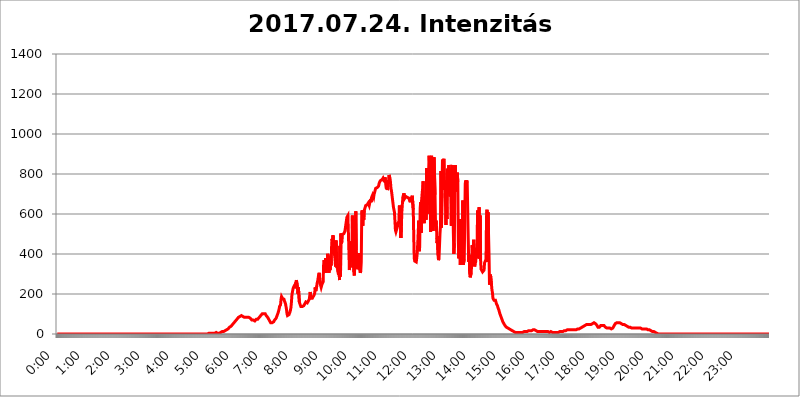
| Category | 2017.07.24. Intenzitás [W/m^2] |
|---|---|
| 0.0 | 0 |
| 0.0006944444444444445 | 0 |
| 0.001388888888888889 | 0 |
| 0.0020833333333333333 | 0 |
| 0.002777777777777778 | 0 |
| 0.003472222222222222 | 0 |
| 0.004166666666666667 | 0 |
| 0.004861111111111111 | 0 |
| 0.005555555555555556 | 0 |
| 0.0062499999999999995 | 0 |
| 0.006944444444444444 | 0 |
| 0.007638888888888889 | 0 |
| 0.008333333333333333 | 0 |
| 0.009027777777777779 | 0 |
| 0.009722222222222222 | 0 |
| 0.010416666666666666 | 0 |
| 0.011111111111111112 | 0 |
| 0.011805555555555555 | 0 |
| 0.012499999999999999 | 0 |
| 0.013194444444444444 | 0 |
| 0.013888888888888888 | 0 |
| 0.014583333333333332 | 0 |
| 0.015277777777777777 | 0 |
| 0.015972222222222224 | 0 |
| 0.016666666666666666 | 0 |
| 0.017361111111111112 | 0 |
| 0.018055555555555557 | 0 |
| 0.01875 | 0 |
| 0.019444444444444445 | 0 |
| 0.02013888888888889 | 0 |
| 0.020833333333333332 | 0 |
| 0.02152777777777778 | 0 |
| 0.022222222222222223 | 0 |
| 0.02291666666666667 | 0 |
| 0.02361111111111111 | 0 |
| 0.024305555555555556 | 0 |
| 0.024999999999999998 | 0 |
| 0.025694444444444447 | 0 |
| 0.02638888888888889 | 0 |
| 0.027083333333333334 | 0 |
| 0.027777777777777776 | 0 |
| 0.02847222222222222 | 0 |
| 0.029166666666666664 | 0 |
| 0.029861111111111113 | 0 |
| 0.030555555555555555 | 0 |
| 0.03125 | 0 |
| 0.03194444444444445 | 0 |
| 0.03263888888888889 | 0 |
| 0.03333333333333333 | 0 |
| 0.034027777777777775 | 0 |
| 0.034722222222222224 | 0 |
| 0.035416666666666666 | 0 |
| 0.036111111111111115 | 0 |
| 0.03680555555555556 | 0 |
| 0.0375 | 0 |
| 0.03819444444444444 | 0 |
| 0.03888888888888889 | 0 |
| 0.03958333333333333 | 0 |
| 0.04027777777777778 | 0 |
| 0.04097222222222222 | 0 |
| 0.041666666666666664 | 0 |
| 0.042361111111111106 | 0 |
| 0.04305555555555556 | 0 |
| 0.043750000000000004 | 0 |
| 0.044444444444444446 | 0 |
| 0.04513888888888889 | 0 |
| 0.04583333333333334 | 0 |
| 0.04652777777777778 | 0 |
| 0.04722222222222222 | 0 |
| 0.04791666666666666 | 0 |
| 0.04861111111111111 | 0 |
| 0.049305555555555554 | 0 |
| 0.049999999999999996 | 0 |
| 0.05069444444444445 | 0 |
| 0.051388888888888894 | 0 |
| 0.052083333333333336 | 0 |
| 0.05277777777777778 | 0 |
| 0.05347222222222222 | 0 |
| 0.05416666666666667 | 0 |
| 0.05486111111111111 | 0 |
| 0.05555555555555555 | 0 |
| 0.05625 | 0 |
| 0.05694444444444444 | 0 |
| 0.057638888888888885 | 0 |
| 0.05833333333333333 | 0 |
| 0.05902777777777778 | 0 |
| 0.059722222222222225 | 0 |
| 0.06041666666666667 | 0 |
| 0.061111111111111116 | 0 |
| 0.06180555555555556 | 0 |
| 0.0625 | 0 |
| 0.06319444444444444 | 0 |
| 0.06388888888888888 | 0 |
| 0.06458333333333334 | 0 |
| 0.06527777777777778 | 0 |
| 0.06597222222222222 | 0 |
| 0.06666666666666667 | 0 |
| 0.06736111111111111 | 0 |
| 0.06805555555555555 | 0 |
| 0.06874999999999999 | 0 |
| 0.06944444444444443 | 0 |
| 0.07013888888888889 | 0 |
| 0.07083333333333333 | 0 |
| 0.07152777777777779 | 0 |
| 0.07222222222222223 | 0 |
| 0.07291666666666667 | 0 |
| 0.07361111111111111 | 0 |
| 0.07430555555555556 | 0 |
| 0.075 | 0 |
| 0.07569444444444444 | 0 |
| 0.0763888888888889 | 0 |
| 0.07708333333333334 | 0 |
| 0.07777777777777778 | 0 |
| 0.07847222222222222 | 0 |
| 0.07916666666666666 | 0 |
| 0.0798611111111111 | 0 |
| 0.08055555555555556 | 0 |
| 0.08125 | 0 |
| 0.08194444444444444 | 0 |
| 0.08263888888888889 | 0 |
| 0.08333333333333333 | 0 |
| 0.08402777777777777 | 0 |
| 0.08472222222222221 | 0 |
| 0.08541666666666665 | 0 |
| 0.08611111111111112 | 0 |
| 0.08680555555555557 | 0 |
| 0.08750000000000001 | 0 |
| 0.08819444444444445 | 0 |
| 0.08888888888888889 | 0 |
| 0.08958333333333333 | 0 |
| 0.09027777777777778 | 0 |
| 0.09097222222222222 | 0 |
| 0.09166666666666667 | 0 |
| 0.09236111111111112 | 0 |
| 0.09305555555555556 | 0 |
| 0.09375 | 0 |
| 0.09444444444444444 | 0 |
| 0.09513888888888888 | 0 |
| 0.09583333333333333 | 0 |
| 0.09652777777777777 | 0 |
| 0.09722222222222222 | 0 |
| 0.09791666666666667 | 0 |
| 0.09861111111111111 | 0 |
| 0.09930555555555555 | 0 |
| 0.09999999999999999 | 0 |
| 0.10069444444444443 | 0 |
| 0.1013888888888889 | 0 |
| 0.10208333333333335 | 0 |
| 0.10277777777777779 | 0 |
| 0.10347222222222223 | 0 |
| 0.10416666666666667 | 0 |
| 0.10486111111111111 | 0 |
| 0.10555555555555556 | 0 |
| 0.10625 | 0 |
| 0.10694444444444444 | 0 |
| 0.1076388888888889 | 0 |
| 0.10833333333333334 | 0 |
| 0.10902777777777778 | 0 |
| 0.10972222222222222 | 0 |
| 0.1111111111111111 | 0 |
| 0.11180555555555556 | 0 |
| 0.11180555555555556 | 0 |
| 0.1125 | 0 |
| 0.11319444444444444 | 0 |
| 0.11388888888888889 | 0 |
| 0.11458333333333333 | 0 |
| 0.11527777777777777 | 0 |
| 0.11597222222222221 | 0 |
| 0.11666666666666665 | 0 |
| 0.1173611111111111 | 0 |
| 0.11805555555555557 | 0 |
| 0.11944444444444445 | 0 |
| 0.12013888888888889 | 0 |
| 0.12083333333333333 | 0 |
| 0.12152777777777778 | 0 |
| 0.12222222222222223 | 0 |
| 0.12291666666666667 | 0 |
| 0.12291666666666667 | 0 |
| 0.12361111111111112 | 0 |
| 0.12430555555555556 | 0 |
| 0.125 | 0 |
| 0.12569444444444444 | 0 |
| 0.12638888888888888 | 0 |
| 0.12708333333333333 | 0 |
| 0.16875 | 0 |
| 0.12847222222222224 | 0 |
| 0.12916666666666668 | 0 |
| 0.12986111111111112 | 0 |
| 0.13055555555555556 | 0 |
| 0.13125 | 0 |
| 0.13194444444444445 | 0 |
| 0.1326388888888889 | 0 |
| 0.13333333333333333 | 0 |
| 0.13402777777777777 | 0 |
| 0.13402777777777777 | 0 |
| 0.13472222222222222 | 0 |
| 0.13541666666666666 | 0 |
| 0.1361111111111111 | 0 |
| 0.13749999999999998 | 0 |
| 0.13819444444444443 | 0 |
| 0.1388888888888889 | 0 |
| 0.13958333333333334 | 0 |
| 0.14027777777777778 | 0 |
| 0.14097222222222222 | 0 |
| 0.14166666666666666 | 0 |
| 0.1423611111111111 | 0 |
| 0.14305555555555557 | 0 |
| 0.14375000000000002 | 0 |
| 0.14444444444444446 | 0 |
| 0.1451388888888889 | 0 |
| 0.1451388888888889 | 0 |
| 0.14652777777777778 | 0 |
| 0.14722222222222223 | 0 |
| 0.14791666666666667 | 0 |
| 0.1486111111111111 | 0 |
| 0.14930555555555555 | 0 |
| 0.15 | 0 |
| 0.15069444444444444 | 0 |
| 0.15138888888888888 | 0 |
| 0.15208333333333332 | 0 |
| 0.15277777777777776 | 0 |
| 0.15347222222222223 | 0 |
| 0.15416666666666667 | 0 |
| 0.15486111111111112 | 0 |
| 0.15555555555555556 | 0 |
| 0.15625 | 0 |
| 0.15694444444444444 | 0 |
| 0.15763888888888888 | 0 |
| 0.15833333333333333 | 0 |
| 0.15902777777777777 | 0 |
| 0.15972222222222224 | 0 |
| 0.16041666666666668 | 0 |
| 0.16111111111111112 | 0 |
| 0.16180555555555556 | 0 |
| 0.1625 | 0 |
| 0.16319444444444445 | 0 |
| 0.1638888888888889 | 0 |
| 0.16458333333333333 | 0 |
| 0.16527777777777777 | 0 |
| 0.16597222222222222 | 0 |
| 0.16666666666666666 | 0 |
| 0.1673611111111111 | 0 |
| 0.16805555555555554 | 0 |
| 0.16874999999999998 | 0 |
| 0.16944444444444443 | 0 |
| 0.17013888888888887 | 0 |
| 0.1708333333333333 | 0 |
| 0.17152777777777775 | 0 |
| 0.17222222222222225 | 0 |
| 0.1729166666666667 | 0 |
| 0.17361111111111113 | 0 |
| 0.17430555555555557 | 0 |
| 0.17500000000000002 | 0 |
| 0.17569444444444446 | 0 |
| 0.1763888888888889 | 0 |
| 0.17708333333333334 | 0 |
| 0.17777777777777778 | 0 |
| 0.17847222222222223 | 0 |
| 0.17916666666666667 | 0 |
| 0.1798611111111111 | 0 |
| 0.18055555555555555 | 0 |
| 0.18125 | 0 |
| 0.18194444444444444 | 0 |
| 0.1826388888888889 | 0 |
| 0.18333333333333335 | 0 |
| 0.1840277777777778 | 0 |
| 0.18472222222222223 | 0 |
| 0.18541666666666667 | 0 |
| 0.18611111111111112 | 0 |
| 0.18680555555555556 | 0 |
| 0.1875 | 0 |
| 0.18819444444444444 | 0 |
| 0.18888888888888888 | 0 |
| 0.18958333333333333 | 0 |
| 0.19027777777777777 | 0 |
| 0.1909722222222222 | 0 |
| 0.19166666666666665 | 0 |
| 0.19236111111111112 | 0 |
| 0.19305555555555554 | 0 |
| 0.19375 | 0 |
| 0.19444444444444445 | 0 |
| 0.1951388888888889 | 0 |
| 0.19583333333333333 | 0 |
| 0.19652777777777777 | 0 |
| 0.19722222222222222 | 0 |
| 0.19791666666666666 | 0 |
| 0.1986111111111111 | 0 |
| 0.19930555555555554 | 0 |
| 0.19999999999999998 | 0 |
| 0.20069444444444443 | 0 |
| 0.20138888888888887 | 0 |
| 0.2020833333333333 | 0 |
| 0.2027777777777778 | 0 |
| 0.2034722222222222 | 0 |
| 0.2041666666666667 | 0 |
| 0.20486111111111113 | 0 |
| 0.20555555555555557 | 0 |
| 0.20625000000000002 | 0 |
| 0.20694444444444446 | 0 |
| 0.2076388888888889 | 0 |
| 0.20833333333333334 | 0 |
| 0.20902777777777778 | 0 |
| 0.20972222222222223 | 0 |
| 0.21041666666666667 | 0 |
| 0.2111111111111111 | 3.525 |
| 0.21180555555555555 | 3.525 |
| 0.2125 | 3.525 |
| 0.21319444444444444 | 3.525 |
| 0.2138888888888889 | 3.525 |
| 0.21458333333333335 | 3.525 |
| 0.2152777777777778 | 3.525 |
| 0.21597222222222223 | 3.525 |
| 0.21666666666666667 | 3.525 |
| 0.21736111111111112 | 3.525 |
| 0.21805555555555556 | 3.525 |
| 0.21875 | 3.525 |
| 0.21944444444444444 | 3.525 |
| 0.22013888888888888 | 3.525 |
| 0.22083333333333333 | 3.525 |
| 0.22152777777777777 | 3.525 |
| 0.2222222222222222 | 3.525 |
| 0.22291666666666665 | 7.887 |
| 0.2236111111111111 | 3.525 |
| 0.22430555555555556 | 3.525 |
| 0.225 | 3.525 |
| 0.22569444444444445 | 3.525 |
| 0.2263888888888889 | 3.525 |
| 0.22708333333333333 | 3.525 |
| 0.22777777777777777 | 7.887 |
| 0.22847222222222222 | 7.887 |
| 0.22916666666666666 | 7.887 |
| 0.2298611111111111 | 7.887 |
| 0.23055555555555554 | 7.887 |
| 0.23124999999999998 | 12.257 |
| 0.23194444444444443 | 12.257 |
| 0.23263888888888887 | 12.257 |
| 0.2333333333333333 | 12.257 |
| 0.2340277777777778 | 12.257 |
| 0.2347222222222222 | 16.636 |
| 0.2354166666666667 | 16.636 |
| 0.23611111111111113 | 16.636 |
| 0.23680555555555557 | 21.024 |
| 0.23750000000000002 | 21.024 |
| 0.23819444444444446 | 25.419 |
| 0.2388888888888889 | 25.419 |
| 0.23958333333333334 | 25.419 |
| 0.24027777777777778 | 29.823 |
| 0.24097222222222223 | 29.823 |
| 0.24166666666666667 | 34.234 |
| 0.2423611111111111 | 34.234 |
| 0.24305555555555555 | 38.653 |
| 0.24375 | 38.653 |
| 0.24444444444444446 | 43.079 |
| 0.24513888888888888 | 43.079 |
| 0.24583333333333335 | 47.511 |
| 0.2465277777777778 | 47.511 |
| 0.24722222222222223 | 51.951 |
| 0.24791666666666667 | 56.398 |
| 0.24861111111111112 | 56.398 |
| 0.24930555555555556 | 60.85 |
| 0.25 | 65.31 |
| 0.25069444444444444 | 65.31 |
| 0.2513888888888889 | 69.775 |
| 0.2520833333333333 | 74.246 |
| 0.25277777777777777 | 78.722 |
| 0.2534722222222222 | 78.722 |
| 0.25416666666666665 | 83.205 |
| 0.2548611111111111 | 87.692 |
| 0.2555555555555556 | 87.692 |
| 0.25625000000000003 | 87.692 |
| 0.2569444444444445 | 92.184 |
| 0.2576388888888889 | 92.184 |
| 0.25833333333333336 | 92.184 |
| 0.2590277777777778 | 87.692 |
| 0.25972222222222224 | 87.692 |
| 0.2604166666666667 | 87.692 |
| 0.2611111111111111 | 83.205 |
| 0.26180555555555557 | 83.205 |
| 0.2625 | 83.205 |
| 0.26319444444444445 | 83.205 |
| 0.2638888888888889 | 83.205 |
| 0.26458333333333334 | 83.205 |
| 0.2652777777777778 | 83.205 |
| 0.2659722222222222 | 83.205 |
| 0.26666666666666666 | 83.205 |
| 0.2673611111111111 | 83.205 |
| 0.26805555555555555 | 83.205 |
| 0.26875 | 83.205 |
| 0.26944444444444443 | 83.205 |
| 0.2701388888888889 | 83.205 |
| 0.2708333333333333 | 78.722 |
| 0.27152777777777776 | 74.246 |
| 0.2722222222222222 | 74.246 |
| 0.27291666666666664 | 69.775 |
| 0.2736111111111111 | 69.775 |
| 0.2743055555555555 | 69.775 |
| 0.27499999999999997 | 69.775 |
| 0.27569444444444446 | 69.775 |
| 0.27638888888888885 | 65.31 |
| 0.27708333333333335 | 65.31 |
| 0.2777777777777778 | 69.775 |
| 0.27847222222222223 | 69.775 |
| 0.2791666666666667 | 74.246 |
| 0.2798611111111111 | 74.246 |
| 0.28055555555555556 | 74.246 |
| 0.28125 | 74.246 |
| 0.28194444444444444 | 78.722 |
| 0.2826388888888889 | 78.722 |
| 0.2833333333333333 | 83.205 |
| 0.28402777777777777 | 83.205 |
| 0.2847222222222222 | 87.692 |
| 0.28541666666666665 | 92.184 |
| 0.28611111111111115 | 96.682 |
| 0.28680555555555554 | 96.682 |
| 0.28750000000000003 | 101.184 |
| 0.2881944444444445 | 101.184 |
| 0.2888888888888889 | 101.184 |
| 0.28958333333333336 | 101.184 |
| 0.2902777777777778 | 101.184 |
| 0.29097222222222224 | 101.184 |
| 0.2916666666666667 | 101.184 |
| 0.2923611111111111 | 96.682 |
| 0.29305555555555557 | 92.184 |
| 0.29375 | 92.184 |
| 0.29444444444444445 | 87.692 |
| 0.2951388888888889 | 83.205 |
| 0.29583333333333334 | 78.722 |
| 0.2965277777777778 | 74.246 |
| 0.2972222222222222 | 69.775 |
| 0.29791666666666666 | 65.31 |
| 0.2986111111111111 | 60.85 |
| 0.29930555555555555 | 56.398 |
| 0.3 | 56.398 |
| 0.30069444444444443 | 56.398 |
| 0.3013888888888889 | 56.398 |
| 0.3020833333333333 | 56.398 |
| 0.30277777777777776 | 60.85 |
| 0.3034722222222222 | 60.85 |
| 0.30416666666666664 | 65.31 |
| 0.3048611111111111 | 69.775 |
| 0.3055555555555555 | 69.775 |
| 0.30624999999999997 | 74.246 |
| 0.3069444444444444 | 78.722 |
| 0.3076388888888889 | 83.205 |
| 0.30833333333333335 | 92.184 |
| 0.3090277777777778 | 96.682 |
| 0.30972222222222223 | 105.69 |
| 0.3104166666666667 | 114.716 |
| 0.3111111111111111 | 123.758 |
| 0.31180555555555556 | 137.347 |
| 0.3125 | 137.347 |
| 0.31319444444444444 | 146.423 |
| 0.3138888888888889 | 173.709 |
| 0.3145833333333333 | 187.378 |
| 0.31527777777777777 | 191.937 |
| 0.3159722222222222 | 178.264 |
| 0.31666666666666665 | 182.82 |
| 0.31736111111111115 | 178.264 |
| 0.31805555555555554 | 173.709 |
| 0.31875000000000003 | 164.605 |
| 0.3194444444444445 | 160.056 |
| 0.3201388888888889 | 150.964 |
| 0.32083333333333336 | 146.423 |
| 0.3215277777777778 | 123.758 |
| 0.32222222222222224 | 101.184 |
| 0.3229166666666667 | 92.184 |
| 0.3236111111111111 | 92.184 |
| 0.32430555555555557 | 92.184 |
| 0.325 | 96.682 |
| 0.32569444444444445 | 101.184 |
| 0.3263888888888889 | 110.201 |
| 0.32708333333333334 | 119.235 |
| 0.3277777777777778 | 132.814 |
| 0.3284722222222222 | 160.056 |
| 0.32916666666666666 | 196.497 |
| 0.3298611111111111 | 210.182 |
| 0.33055555555555555 | 223.873 |
| 0.33125 | 233 |
| 0.33194444444444443 | 233 |
| 0.3326388888888889 | 242.127 |
| 0.3333333333333333 | 228.436 |
| 0.3340277777777778 | 228.436 |
| 0.3347222222222222 | 255.813 |
| 0.3354166666666667 | 269.49 |
| 0.3361111111111111 | 264.932 |
| 0.3368055555555556 | 237.564 |
| 0.33749999999999997 | 201.058 |
| 0.33819444444444446 | 233 |
| 0.33888888888888885 | 228.436 |
| 0.33958333333333335 | 160.056 |
| 0.34027777777777773 | 150.964 |
| 0.34097222222222223 | 146.423 |
| 0.3416666666666666 | 137.347 |
| 0.3423611111111111 | 137.347 |
| 0.3430555555555555 | 137.347 |
| 0.34375 | 137.347 |
| 0.3444444444444445 | 137.347 |
| 0.3451388888888889 | 141.884 |
| 0.3458333333333334 | 141.884 |
| 0.34652777777777777 | 146.423 |
| 0.34722222222222227 | 150.964 |
| 0.34791666666666665 | 155.509 |
| 0.34861111111111115 | 160.056 |
| 0.34930555555555554 | 160.056 |
| 0.35000000000000003 | 155.509 |
| 0.3506944444444444 | 155.509 |
| 0.3513888888888889 | 160.056 |
| 0.3520833333333333 | 164.605 |
| 0.3527777777777778 | 169.156 |
| 0.3534722222222222 | 173.709 |
| 0.3541666666666667 | 191.937 |
| 0.3548611111111111 | 210.182 |
| 0.35555555555555557 | 178.264 |
| 0.35625 | 182.82 |
| 0.35694444444444445 | 178.264 |
| 0.3576388888888889 | 178.264 |
| 0.35833333333333334 | 182.82 |
| 0.3590277777777778 | 187.378 |
| 0.3597222222222222 | 191.937 |
| 0.36041666666666666 | 196.497 |
| 0.3611111111111111 | 205.62 |
| 0.36180555555555555 | 233 |
| 0.3625 | 214.746 |
| 0.36319444444444443 | 210.182 |
| 0.3638888888888889 | 237.564 |
| 0.3645833333333333 | 255.813 |
| 0.3652777777777778 | 264.932 |
| 0.3659722222222222 | 264.932 |
| 0.3666666666666667 | 296.808 |
| 0.3673611111111111 | 305.898 |
| 0.3680555555555556 | 305.898 |
| 0.36874999999999997 | 251.251 |
| 0.36944444444444446 | 242.127 |
| 0.37013888888888885 | 233 |
| 0.37083333333333335 | 242.127 |
| 0.37152777777777773 | 251.251 |
| 0.37222222222222223 | 255.813 |
| 0.3729166666666666 | 260.373 |
| 0.3736111111111111 | 346.682 |
| 0.3743055555555555 | 369.23 |
| 0.375 | 373.729 |
| 0.3756944444444445 | 333.113 |
| 0.3763888888888889 | 378.224 |
| 0.3770833333333334 | 305.898 |
| 0.37777777777777777 | 364.728 |
| 0.37847222222222227 | 324.052 |
| 0.37916666666666665 | 400.638 |
| 0.37986111111111115 | 396.164 |
| 0.38055555555555554 | 382.715 |
| 0.38125000000000003 | 305.898 |
| 0.3819444444444444 | 387.202 |
| 0.3826388888888889 | 319.517 |
| 0.3833333333333333 | 369.23 |
| 0.3840277777777778 | 342.162 |
| 0.3847222222222222 | 431.833 |
| 0.3854166666666667 | 475.972 |
| 0.3861111111111111 | 458.38 |
| 0.38680555555555557 | 493.475 |
| 0.3875 | 493.475 |
| 0.38819444444444445 | 422.943 |
| 0.3888888888888889 | 396.164 |
| 0.38958333333333334 | 373.729 |
| 0.3902777777777778 | 337.639 |
| 0.3909722222222222 | 467.187 |
| 0.39166666666666666 | 391.685 |
| 0.3923611111111111 | 328.584 |
| 0.39305555555555555 | 342.162 |
| 0.39375 | 310.44 |
| 0.39444444444444443 | 296.808 |
| 0.3951388888888889 | 351.198 |
| 0.3958333333333333 | 269.49 |
| 0.3965277777777778 | 440.702 |
| 0.3972222222222222 | 287.709 |
| 0.3979166666666667 | 502.192 |
| 0.3986111111111111 | 453.968 |
| 0.3993055555555556 | 462.786 |
| 0.39999999999999997 | 497.836 |
| 0.40069444444444446 | 497.836 |
| 0.40138888888888885 | 493.475 |
| 0.40208333333333335 | 502.192 |
| 0.40277777777777773 | 506.542 |
| 0.40347222222222223 | 515.223 |
| 0.4041666666666666 | 532.513 |
| 0.4048611111111111 | 549.704 |
| 0.4055555555555555 | 566.793 |
| 0.40625 | 583.779 |
| 0.4069444444444445 | 588.009 |
| 0.4076388888888889 | 592.233 |
| 0.4083333333333334 | 592.233 |
| 0.40902777777777777 | 418.492 |
| 0.40972222222222227 | 319.517 |
| 0.41041666666666665 | 319.517 |
| 0.41111111111111115 | 462.786 |
| 0.41180555555555554 | 369.23 |
| 0.41250000000000003 | 360.221 |
| 0.4131944444444444 | 373.729 |
| 0.4138888888888889 | 592.233 |
| 0.4145833333333333 | 333.113 |
| 0.4152777777777778 | 519.555 |
| 0.4159722222222222 | 310.44 |
| 0.4166666666666667 | 292.259 |
| 0.4173611111111111 | 342.162 |
| 0.41805555555555557 | 536.82 |
| 0.41875 | 613.252 |
| 0.41944444444444445 | 418.492 |
| 0.4201388888888889 | 422.943 |
| 0.42083333333333334 | 337.639 |
| 0.4215277777777778 | 324.052 |
| 0.4222222222222222 | 351.198 |
| 0.42291666666666666 | 405.108 |
| 0.4236111111111111 | 328.584 |
| 0.42430555555555555 | 319.517 |
| 0.425 | 305.898 |
| 0.42569444444444443 | 314.98 |
| 0.4263888888888889 | 360.221 |
| 0.4270833333333333 | 609.062 |
| 0.4277777777777778 | 617.436 |
| 0.4284722222222222 | 541.121 |
| 0.4291666666666667 | 617.436 |
| 0.4298611111111111 | 571.049 |
| 0.4305555555555556 | 617.436 |
| 0.43124999999999997 | 621.613 |
| 0.43194444444444446 | 634.105 |
| 0.43263888888888885 | 642.4 |
| 0.43333333333333335 | 642.4 |
| 0.43402777777777773 | 642.4 |
| 0.43472222222222223 | 646.537 |
| 0.4354166666666666 | 650.667 |
| 0.4361111111111111 | 654.791 |
| 0.4368055555555555 | 658.909 |
| 0.4375 | 642.4 |
| 0.4381944444444445 | 654.791 |
| 0.4388888888888889 | 663.019 |
| 0.4395833333333334 | 675.311 |
| 0.44027777777777777 | 658.909 |
| 0.44097222222222227 | 683.473 |
| 0.44166666666666665 | 683.473 |
| 0.44236111111111115 | 695.666 |
| 0.44305555555555554 | 695.666 |
| 0.44375000000000003 | 683.473 |
| 0.4444444444444444 | 699.717 |
| 0.4451388888888889 | 707.8 |
| 0.4458333333333333 | 703.762 |
| 0.4465277777777778 | 727.896 |
| 0.4472222222222222 | 723.889 |
| 0.4479166666666667 | 727.896 |
| 0.4486111111111111 | 731.896 |
| 0.44930555555555557 | 735.89 |
| 0.45 | 735.89 |
| 0.45069444444444445 | 739.877 |
| 0.4513888888888889 | 751.803 |
| 0.45208333333333334 | 759.723 |
| 0.4527777777777778 | 759.723 |
| 0.4534722222222222 | 767.62 |
| 0.45416666666666666 | 767.62 |
| 0.4548611111111111 | 767.62 |
| 0.45555555555555555 | 771.559 |
| 0.45625 | 775.492 |
| 0.45694444444444443 | 779.42 |
| 0.4576388888888889 | 779.42 |
| 0.4583333333333333 | 779.42 |
| 0.4590277777777778 | 759.723 |
| 0.4597222222222222 | 783.342 |
| 0.4604166666666667 | 759.723 |
| 0.4611111111111111 | 735.89 |
| 0.4618055555555556 | 723.889 |
| 0.46249999999999997 | 751.803 |
| 0.46319444444444446 | 719.877 |
| 0.46388888888888885 | 727.896 |
| 0.46458333333333335 | 759.723 |
| 0.46527777777777773 | 795.074 |
| 0.46597222222222223 | 787.258 |
| 0.4666666666666666 | 779.42 |
| 0.4673611111111111 | 759.723 |
| 0.4680555555555555 | 727.896 |
| 0.46875 | 715.858 |
| 0.4694444444444445 | 711.832 |
| 0.4701388888888889 | 675.311 |
| 0.4708333333333334 | 654.791 |
| 0.47152777777777777 | 634.105 |
| 0.47222222222222227 | 629.948 |
| 0.47291666666666665 | 609.062 |
| 0.47361111111111115 | 566.793 |
| 0.47430555555555554 | 519.555 |
| 0.47500000000000003 | 510.885 |
| 0.4756944444444444 | 510.885 |
| 0.4763888888888889 | 506.542 |
| 0.4770833333333333 | 536.82 |
| 0.4777777777777778 | 553.986 |
| 0.4784722222222222 | 553.986 |
| 0.4791666666666667 | 562.53 |
| 0.4798611111111111 | 642.4 |
| 0.48055555555555557 | 583.779 |
| 0.48125 | 625.784 |
| 0.48194444444444445 | 480.356 |
| 0.4826388888888889 | 536.82 |
| 0.48333333333333334 | 613.252 |
| 0.4840277777777778 | 609.062 |
| 0.4847222222222222 | 683.473 |
| 0.48541666666666666 | 687.544 |
| 0.4861111111111111 | 703.762 |
| 0.48680555555555555 | 699.717 |
| 0.4875 | 679.395 |
| 0.48819444444444443 | 675.311 |
| 0.4888888888888889 | 687.544 |
| 0.4895833333333333 | 691.608 |
| 0.4902777777777778 | 687.544 |
| 0.4909722222222222 | 683.473 |
| 0.4916666666666667 | 679.395 |
| 0.4923611111111111 | 687.544 |
| 0.4930555555555556 | 679.395 |
| 0.49374999999999997 | 675.311 |
| 0.49444444444444446 | 679.395 |
| 0.49513888888888885 | 658.909 |
| 0.49583333333333335 | 683.473 |
| 0.49652777777777773 | 675.311 |
| 0.49722222222222223 | 679.395 |
| 0.4979166666666666 | 691.608 |
| 0.4986111111111111 | 691.608 |
| 0.4993055555555555 | 621.613 |
| 0.5 | 489.108 |
| 0.5006944444444444 | 378.224 |
| 0.5013888888888889 | 364.728 |
| 0.5020833333333333 | 369.23 |
| 0.5027777777777778 | 360.221 |
| 0.5034722222222222 | 360.221 |
| 0.5041666666666667 | 378.224 |
| 0.5048611111111111 | 405.108 |
| 0.5055555555555555 | 449.551 |
| 0.50625 | 506.542 |
| 0.5069444444444444 | 566.793 |
| 0.5076388888888889 | 414.035 |
| 0.5083333333333333 | 436.27 |
| 0.5090277777777777 | 629.948 |
| 0.5097222222222222 | 658.909 |
| 0.5104166666666666 | 506.542 |
| 0.5111111111111112 | 671.22 |
| 0.5118055555555555 | 703.762 |
| 0.5125000000000001 | 727.896 |
| 0.5131944444444444 | 763.674 |
| 0.513888888888889 | 592.233 |
| 0.5145833333333333 | 553.986 |
| 0.5152777777777778 | 549.704 |
| 0.5159722222222222 | 691.608 |
| 0.5166666666666667 | 683.473 |
| 0.517361111111111 | 571.049 |
| 0.5180555555555556 | 829.981 |
| 0.5187499999999999 | 600.661 |
| 0.5194444444444445 | 683.473 |
| 0.5201388888888888 | 783.342 |
| 0.5208333333333334 | 806.757 |
| 0.5215277777777778 | 891.099 |
| 0.5222222222222223 | 894.885 |
| 0.5229166666666667 | 806.757 |
| 0.5236111111111111 | 510.885 |
| 0.5243055555555556 | 545.416 |
| 0.525 | 891.099 |
| 0.5256944444444445 | 650.667 |
| 0.5263888888888889 | 646.537 |
| 0.5270833333333333 | 515.223 |
| 0.5277777777777778 | 549.704 |
| 0.5284722222222222 | 883.516 |
| 0.5291666666666667 | 879.719 |
| 0.5298611111111111 | 695.666 |
| 0.5305555555555556 | 545.416 |
| 0.53125 | 566.793 |
| 0.5319444444444444 | 528.2 |
| 0.5326388888888889 | 453.968 |
| 0.5333333333333333 | 489.108 |
| 0.5340277777777778 | 396.164 |
| 0.5347222222222222 | 369.23 |
| 0.5354166666666667 | 378.224 |
| 0.5361111111111111 | 440.702 |
| 0.5368055555555555 | 502.192 |
| 0.5375 | 541.121 |
| 0.5381944444444444 | 814.519 |
| 0.5388888888888889 | 532.513 |
| 0.5395833333333333 | 703.762 |
| 0.5402777777777777 | 872.114 |
| 0.5409722222222222 | 860.676 |
| 0.5416666666666666 | 860.676 |
| 0.5423611111111112 | 875.918 |
| 0.5430555555555555 | 719.877 |
| 0.5437500000000001 | 767.62 |
| 0.5444444444444444 | 667.123 |
| 0.545138888888889 | 545.416 |
| 0.5458333333333333 | 675.311 |
| 0.5465277777777778 | 575.299 |
| 0.5472222222222222 | 826.123 |
| 0.5479166666666667 | 727.896 |
| 0.548611111111111 | 699.717 |
| 0.5493055555555556 | 845.365 |
| 0.5499999999999999 | 806.757 |
| 0.5506944444444445 | 687.544 |
| 0.5513888888888888 | 683.473 |
| 0.5520833333333334 | 802.868 |
| 0.5527777777777778 | 541.121 |
| 0.5534722222222223 | 833.834 |
| 0.5541666666666667 | 845.365 |
| 0.5548611111111111 | 671.22 |
| 0.5555555555555556 | 506.542 |
| 0.55625 | 400.638 |
| 0.5569444444444445 | 453.968 |
| 0.5576388888888889 | 727.896 |
| 0.5583333333333333 | 845.365 |
| 0.5590277777777778 | 779.42 |
| 0.5597222222222222 | 763.674 |
| 0.5604166666666667 | 711.832 |
| 0.5611111111111111 | 806.757 |
| 0.5618055555555556 | 759.723 |
| 0.5625 | 467.187 |
| 0.5631944444444444 | 378.224 |
| 0.5638888888888889 | 382.715 |
| 0.5645833333333333 | 575.299 |
| 0.5652777777777778 | 346.682 |
| 0.5659722222222222 | 360.221 |
| 0.5666666666666667 | 396.164 |
| 0.5673611111111111 | 422.943 |
| 0.5680555555555555 | 471.582 |
| 0.56875 | 667.123 |
| 0.5694444444444444 | 346.682 |
| 0.5701388888888889 | 351.198 |
| 0.5708333333333333 | 373.729 |
| 0.5715277777777777 | 378.224 |
| 0.5722222222222222 | 751.803 |
| 0.5729166666666666 | 767.62 |
| 0.5736111111111112 | 751.803 |
| 0.5743055555555555 | 767.62 |
| 0.5750000000000001 | 755.766 |
| 0.5756944444444444 | 759.723 |
| 0.576388888888889 | 480.356 |
| 0.5770833333333333 | 360.221 |
| 0.5777777777777778 | 396.164 |
| 0.5784722222222222 | 301.354 |
| 0.5791666666666667 | 283.156 |
| 0.579861111111111 | 287.709 |
| 0.5805555555555556 | 305.898 |
| 0.5812499999999999 | 351.198 |
| 0.5819444444444445 | 445.129 |
| 0.5826388888888888 | 414.035 |
| 0.5833333333333334 | 427.39 |
| 0.5840277777777778 | 471.582 |
| 0.5847222222222223 | 351.198 |
| 0.5854166666666667 | 337.639 |
| 0.5861111111111111 | 351.198 |
| 0.5868055555555556 | 360.221 |
| 0.5875 | 387.202 |
| 0.5881944444444445 | 431.833 |
| 0.5888888888888889 | 471.582 |
| 0.5895833333333333 | 617.436 |
| 0.5902777777777778 | 378.224 |
| 0.5909722222222222 | 387.202 |
| 0.5916666666666667 | 634.105 |
| 0.5923611111111111 | 378.224 |
| 0.5930555555555556 | 592.233 |
| 0.59375 | 369.23 |
| 0.5944444444444444 | 324.052 |
| 0.5951388888888889 | 324.052 |
| 0.5958333333333333 | 324.052 |
| 0.5965277777777778 | 310.44 |
| 0.5972222222222222 | 305.898 |
| 0.5979166666666667 | 305.898 |
| 0.5986111111111111 | 319.517 |
| 0.5993055555555555 | 355.712 |
| 0.6 | 360.221 |
| 0.6006944444444444 | 351.198 |
| 0.6013888888888889 | 373.729 |
| 0.6020833333333333 | 583.779 |
| 0.6027777777777777 | 621.613 |
| 0.6034722222222222 | 360.221 |
| 0.6041666666666666 | 609.062 |
| 0.6048611111111112 | 502.192 |
| 0.6055555555555555 | 400.638 |
| 0.6062500000000001 | 246.689 |
| 0.6069444444444444 | 246.689 |
| 0.607638888888889 | 296.808 |
| 0.6083333333333333 | 296.808 |
| 0.6090277777777778 | 246.689 |
| 0.6097222222222222 | 219.309 |
| 0.6104166666666667 | 205.62 |
| 0.611111111111111 | 178.264 |
| 0.6118055555555556 | 173.709 |
| 0.6124999999999999 | 169.156 |
| 0.6131944444444445 | 173.709 |
| 0.6138888888888888 | 173.709 |
| 0.6145833333333334 | 169.156 |
| 0.6152777777777778 | 160.056 |
| 0.6159722222222223 | 150.964 |
| 0.6166666666666667 | 146.423 |
| 0.6173611111111111 | 141.884 |
| 0.6180555555555556 | 132.814 |
| 0.61875 | 128.284 |
| 0.6194444444444445 | 119.235 |
| 0.6201388888888889 | 110.201 |
| 0.6208333333333333 | 101.184 |
| 0.6215277777777778 | 96.682 |
| 0.6222222222222222 | 87.692 |
| 0.6229166666666667 | 83.205 |
| 0.6236111111111111 | 74.246 |
| 0.6243055555555556 | 69.775 |
| 0.625 | 60.85 |
| 0.6256944444444444 | 56.398 |
| 0.6263888888888889 | 51.951 |
| 0.6270833333333333 | 47.511 |
| 0.6277777777777778 | 43.079 |
| 0.6284722222222222 | 38.653 |
| 0.6291666666666667 | 38.653 |
| 0.6298611111111111 | 34.234 |
| 0.6305555555555555 | 34.234 |
| 0.63125 | 29.823 |
| 0.6319444444444444 | 29.823 |
| 0.6326388888888889 | 25.419 |
| 0.6333333333333333 | 25.419 |
| 0.6340277777777777 | 25.419 |
| 0.6347222222222222 | 21.024 |
| 0.6354166666666666 | 21.024 |
| 0.6361111111111112 | 21.024 |
| 0.6368055555555555 | 16.636 |
| 0.6375000000000001 | 16.636 |
| 0.6381944444444444 | 16.636 |
| 0.638888888888889 | 12.257 |
| 0.6395833333333333 | 12.257 |
| 0.6402777777777778 | 12.257 |
| 0.6409722222222222 | 7.887 |
| 0.6416666666666667 | 7.887 |
| 0.642361111111111 | 7.887 |
| 0.6430555555555556 | 7.887 |
| 0.6437499999999999 | 7.887 |
| 0.6444444444444445 | 7.887 |
| 0.6451388888888888 | 7.887 |
| 0.6458333333333334 | 7.887 |
| 0.6465277777777778 | 7.887 |
| 0.6472222222222223 | 7.887 |
| 0.6479166666666667 | 7.887 |
| 0.6486111111111111 | 7.887 |
| 0.6493055555555556 | 7.887 |
| 0.65 | 7.887 |
| 0.6506944444444445 | 7.887 |
| 0.6513888888888889 | 7.887 |
| 0.6520833333333333 | 7.887 |
| 0.6527777777777778 | 7.887 |
| 0.6534722222222222 | 7.887 |
| 0.6541666666666667 | 7.887 |
| 0.6548611111111111 | 12.257 |
| 0.6555555555555556 | 12.257 |
| 0.65625 | 12.257 |
| 0.6569444444444444 | 12.257 |
| 0.6576388888888889 | 12.257 |
| 0.6583333333333333 | 12.257 |
| 0.6590277777777778 | 12.257 |
| 0.6597222222222222 | 12.257 |
| 0.6604166666666667 | 12.257 |
| 0.6611111111111111 | 16.636 |
| 0.6618055555555555 | 12.257 |
| 0.6625 | 12.257 |
| 0.6631944444444444 | 16.636 |
| 0.6638888888888889 | 16.636 |
| 0.6645833333333333 | 16.636 |
| 0.6652777777777777 | 16.636 |
| 0.6659722222222222 | 21.024 |
| 0.6666666666666666 | 21.024 |
| 0.6673611111111111 | 21.024 |
| 0.6680555555555556 | 21.024 |
| 0.6687500000000001 | 21.024 |
| 0.6694444444444444 | 21.024 |
| 0.6701388888888888 | 21.024 |
| 0.6708333333333334 | 16.636 |
| 0.6715277777777778 | 16.636 |
| 0.6722222222222222 | 16.636 |
| 0.6729166666666666 | 16.636 |
| 0.6736111111111112 | 12.257 |
| 0.6743055555555556 | 12.257 |
| 0.6749999999999999 | 12.257 |
| 0.6756944444444444 | 12.257 |
| 0.6763888888888889 | 12.257 |
| 0.6770833333333334 | 12.257 |
| 0.6777777777777777 | 12.257 |
| 0.6784722222222223 | 12.257 |
| 0.6791666666666667 | 12.257 |
| 0.6798611111111111 | 12.257 |
| 0.6805555555555555 | 12.257 |
| 0.68125 | 12.257 |
| 0.6819444444444445 | 12.257 |
| 0.6826388888888889 | 12.257 |
| 0.6833333333333332 | 12.257 |
| 0.6840277777777778 | 12.257 |
| 0.6847222222222222 | 12.257 |
| 0.6854166666666667 | 12.257 |
| 0.686111111111111 | 12.257 |
| 0.6868055555555556 | 12.257 |
| 0.6875 | 12.257 |
| 0.6881944444444444 | 12.257 |
| 0.688888888888889 | 7.887 |
| 0.6895833333333333 | 7.887 |
| 0.6902777777777778 | 7.887 |
| 0.6909722222222222 | 7.887 |
| 0.6916666666666668 | 7.887 |
| 0.6923611111111111 | 12.257 |
| 0.6930555555555555 | 12.257 |
| 0.69375 | 12.257 |
| 0.6944444444444445 | 7.887 |
| 0.6951388888888889 | 7.887 |
| 0.6958333333333333 | 12.257 |
| 0.6965277777777777 | 7.887 |
| 0.6972222222222223 | 7.887 |
| 0.6979166666666666 | 7.887 |
| 0.6986111111111111 | 7.887 |
| 0.6993055555555556 | 7.887 |
| 0.7000000000000001 | 7.887 |
| 0.7006944444444444 | 7.887 |
| 0.7013888888888888 | 7.887 |
| 0.7020833333333334 | 7.887 |
| 0.7027777777777778 | 7.887 |
| 0.7034722222222222 | 7.887 |
| 0.7041666666666666 | 12.257 |
| 0.7048611111111112 | 12.257 |
| 0.7055555555555556 | 12.257 |
| 0.7062499999999999 | 12.257 |
| 0.7069444444444444 | 12.257 |
| 0.7076388888888889 | 12.257 |
| 0.7083333333333334 | 12.257 |
| 0.7090277777777777 | 12.257 |
| 0.7097222222222223 | 12.257 |
| 0.7104166666666667 | 16.636 |
| 0.7111111111111111 | 16.636 |
| 0.7118055555555555 | 16.636 |
| 0.7125 | 16.636 |
| 0.7131944444444445 | 16.636 |
| 0.7138888888888889 | 16.636 |
| 0.7145833333333332 | 21.024 |
| 0.7152777777777778 | 21.024 |
| 0.7159722222222222 | 21.024 |
| 0.7166666666666667 | 21.024 |
| 0.717361111111111 | 21.024 |
| 0.7180555555555556 | 21.024 |
| 0.71875 | 21.024 |
| 0.7194444444444444 | 21.024 |
| 0.720138888888889 | 21.024 |
| 0.7208333333333333 | 21.024 |
| 0.7215277777777778 | 21.024 |
| 0.7222222222222222 | 21.024 |
| 0.7229166666666668 | 21.024 |
| 0.7236111111111111 | 21.024 |
| 0.7243055555555555 | 21.024 |
| 0.725 | 21.024 |
| 0.7256944444444445 | 21.024 |
| 0.7263888888888889 | 21.024 |
| 0.7270833333333333 | 21.024 |
| 0.7277777777777777 | 21.024 |
| 0.7284722222222223 | 25.419 |
| 0.7291666666666666 | 25.419 |
| 0.7298611111111111 | 25.419 |
| 0.7305555555555556 | 25.419 |
| 0.7312500000000001 | 25.419 |
| 0.7319444444444444 | 25.419 |
| 0.7326388888888888 | 25.419 |
| 0.7333333333333334 | 29.823 |
| 0.7340277777777778 | 29.823 |
| 0.7347222222222222 | 29.823 |
| 0.7354166666666666 | 34.234 |
| 0.7361111111111112 | 34.234 |
| 0.7368055555555556 | 34.234 |
| 0.7374999999999999 | 34.234 |
| 0.7381944444444444 | 38.653 |
| 0.7388888888888889 | 38.653 |
| 0.7395833333333334 | 38.653 |
| 0.7402777777777777 | 43.079 |
| 0.7409722222222223 | 43.079 |
| 0.7416666666666667 | 43.079 |
| 0.7423611111111111 | 47.511 |
| 0.7430555555555555 | 47.511 |
| 0.74375 | 43.079 |
| 0.7444444444444445 | 47.511 |
| 0.7451388888888889 | 43.079 |
| 0.7458333333333332 | 43.079 |
| 0.7465277777777778 | 47.511 |
| 0.7472222222222222 | 47.511 |
| 0.7479166666666667 | 47.511 |
| 0.748611111111111 | 47.511 |
| 0.7493055555555556 | 47.511 |
| 0.75 | 51.951 |
| 0.7506944444444444 | 51.951 |
| 0.751388888888889 | 56.398 |
| 0.7520833333333333 | 56.398 |
| 0.7527777777777778 | 56.398 |
| 0.7534722222222222 | 56.398 |
| 0.7541666666666668 | 56.398 |
| 0.7548611111111111 | 51.951 |
| 0.7555555555555555 | 47.511 |
| 0.75625 | 47.511 |
| 0.7569444444444445 | 43.079 |
| 0.7576388888888889 | 38.653 |
| 0.7583333333333333 | 34.234 |
| 0.7590277777777777 | 34.234 |
| 0.7597222222222223 | 34.234 |
| 0.7604166666666666 | 34.234 |
| 0.7611111111111111 | 34.234 |
| 0.7618055555555556 | 38.653 |
| 0.7625000000000001 | 43.079 |
| 0.7631944444444444 | 43.079 |
| 0.7638888888888888 | 43.079 |
| 0.7645833333333334 | 43.079 |
| 0.7652777777777778 | 43.079 |
| 0.7659722222222222 | 43.079 |
| 0.7666666666666666 | 43.079 |
| 0.7673611111111112 | 38.653 |
| 0.7680555555555556 | 38.653 |
| 0.7687499999999999 | 34.234 |
| 0.7694444444444444 | 29.823 |
| 0.7701388888888889 | 29.823 |
| 0.7708333333333334 | 29.823 |
| 0.7715277777777777 | 29.823 |
| 0.7722222222222223 | 29.823 |
| 0.7729166666666667 | 29.823 |
| 0.7736111111111111 | 29.823 |
| 0.7743055555555555 | 29.823 |
| 0.775 | 29.823 |
| 0.7756944444444445 | 29.823 |
| 0.7763888888888889 | 25.419 |
| 0.7770833333333332 | 25.419 |
| 0.7777777777777778 | 25.419 |
| 0.7784722222222222 | 25.419 |
| 0.7791666666666667 | 29.823 |
| 0.779861111111111 | 29.823 |
| 0.7805555555555556 | 34.234 |
| 0.78125 | 43.079 |
| 0.7819444444444444 | 47.511 |
| 0.782638888888889 | 51.951 |
| 0.7833333333333333 | 56.398 |
| 0.7840277777777778 | 56.398 |
| 0.7847222222222222 | 56.398 |
| 0.7854166666666668 | 60.85 |
| 0.7861111111111111 | 60.85 |
| 0.7868055555555555 | 56.398 |
| 0.7875 | 56.398 |
| 0.7881944444444445 | 56.398 |
| 0.7888888888888889 | 56.398 |
| 0.7895833333333333 | 56.398 |
| 0.7902777777777777 | 51.951 |
| 0.7909722222222223 | 51.951 |
| 0.7916666666666666 | 47.511 |
| 0.7923611111111111 | 47.511 |
| 0.7930555555555556 | 47.511 |
| 0.7937500000000001 | 47.511 |
| 0.7944444444444444 | 47.511 |
| 0.7951388888888888 | 47.511 |
| 0.7958333333333334 | 47.511 |
| 0.7965277777777778 | 43.079 |
| 0.7972222222222222 | 43.079 |
| 0.7979166666666666 | 38.653 |
| 0.7986111111111112 | 38.653 |
| 0.7993055555555556 | 38.653 |
| 0.7999999999999999 | 34.234 |
| 0.8006944444444444 | 34.234 |
| 0.8013888888888889 | 34.234 |
| 0.8020833333333334 | 34.234 |
| 0.8027777777777777 | 34.234 |
| 0.8034722222222223 | 34.234 |
| 0.8041666666666667 | 34.234 |
| 0.8048611111111111 | 34.234 |
| 0.8055555555555555 | 29.823 |
| 0.80625 | 29.823 |
| 0.8069444444444445 | 29.823 |
| 0.8076388888888889 | 29.823 |
| 0.8083333333333332 | 29.823 |
| 0.8090277777777778 | 29.823 |
| 0.8097222222222222 | 29.823 |
| 0.8104166666666667 | 29.823 |
| 0.811111111111111 | 29.823 |
| 0.8118055555555556 | 29.823 |
| 0.8125 | 29.823 |
| 0.8131944444444444 | 29.823 |
| 0.813888888888889 | 29.823 |
| 0.8145833333333333 | 29.823 |
| 0.8152777777777778 | 29.823 |
| 0.8159722222222222 | 29.823 |
| 0.8166666666666668 | 29.823 |
| 0.8173611111111111 | 29.823 |
| 0.8180555555555555 | 29.823 |
| 0.81875 | 25.419 |
| 0.8194444444444445 | 25.419 |
| 0.8201388888888889 | 25.419 |
| 0.8208333333333333 | 25.419 |
| 0.8215277777777777 | 25.419 |
| 0.8222222222222223 | 25.419 |
| 0.8229166666666666 | 25.419 |
| 0.8236111111111111 | 25.419 |
| 0.8243055555555556 | 25.419 |
| 0.8250000000000001 | 25.419 |
| 0.8256944444444444 | 25.419 |
| 0.8263888888888888 | 25.419 |
| 0.8270833333333334 | 21.024 |
| 0.8277777777777778 | 21.024 |
| 0.8284722222222222 | 21.024 |
| 0.8291666666666666 | 21.024 |
| 0.8298611111111112 | 21.024 |
| 0.8305555555555556 | 21.024 |
| 0.8312499999999999 | 21.024 |
| 0.8319444444444444 | 21.024 |
| 0.8326388888888889 | 16.636 |
| 0.8333333333333334 | 16.636 |
| 0.8340277777777777 | 12.257 |
| 0.8347222222222223 | 12.257 |
| 0.8354166666666667 | 12.257 |
| 0.8361111111111111 | 12.257 |
| 0.8368055555555555 | 12.257 |
| 0.8375 | 7.887 |
| 0.8381944444444445 | 7.887 |
| 0.8388888888888889 | 7.887 |
| 0.8395833333333332 | 3.525 |
| 0.8402777777777778 | 3.525 |
| 0.8409722222222222 | 3.525 |
| 0.8416666666666667 | 3.525 |
| 0.842361111111111 | 0 |
| 0.8430555555555556 | 0 |
| 0.84375 | 0 |
| 0.8444444444444444 | 0 |
| 0.845138888888889 | 0 |
| 0.8458333333333333 | 0 |
| 0.8465277777777778 | 0 |
| 0.8472222222222222 | 0 |
| 0.8479166666666668 | 0 |
| 0.8486111111111111 | 0 |
| 0.8493055555555555 | 0 |
| 0.85 | 0 |
| 0.8506944444444445 | 0 |
| 0.8513888888888889 | 0 |
| 0.8520833333333333 | 0 |
| 0.8527777777777777 | 0 |
| 0.8534722222222223 | 0 |
| 0.8541666666666666 | 0 |
| 0.8548611111111111 | 0 |
| 0.8555555555555556 | 0 |
| 0.8562500000000001 | 0 |
| 0.8569444444444444 | 0 |
| 0.8576388888888888 | 0 |
| 0.8583333333333334 | 0 |
| 0.8590277777777778 | 0 |
| 0.8597222222222222 | 0 |
| 0.8604166666666666 | 0 |
| 0.8611111111111112 | 0 |
| 0.8618055555555556 | 0 |
| 0.8624999999999999 | 0 |
| 0.8631944444444444 | 0 |
| 0.8638888888888889 | 0 |
| 0.8645833333333334 | 0 |
| 0.8652777777777777 | 0 |
| 0.8659722222222223 | 0 |
| 0.8666666666666667 | 0 |
| 0.8673611111111111 | 0 |
| 0.8680555555555555 | 0 |
| 0.86875 | 0 |
| 0.8694444444444445 | 0 |
| 0.8701388888888889 | 0 |
| 0.8708333333333332 | 0 |
| 0.8715277777777778 | 0 |
| 0.8722222222222222 | 0 |
| 0.8729166666666667 | 0 |
| 0.873611111111111 | 0 |
| 0.8743055555555556 | 0 |
| 0.875 | 0 |
| 0.8756944444444444 | 0 |
| 0.876388888888889 | 0 |
| 0.8770833333333333 | 0 |
| 0.8777777777777778 | 0 |
| 0.8784722222222222 | 0 |
| 0.8791666666666668 | 0 |
| 0.8798611111111111 | 0 |
| 0.8805555555555555 | 0 |
| 0.88125 | 0 |
| 0.8819444444444445 | 0 |
| 0.8826388888888889 | 0 |
| 0.8833333333333333 | 0 |
| 0.8840277777777777 | 0 |
| 0.8847222222222223 | 0 |
| 0.8854166666666666 | 0 |
| 0.8861111111111111 | 0 |
| 0.8868055555555556 | 0 |
| 0.8875000000000001 | 0 |
| 0.8881944444444444 | 0 |
| 0.8888888888888888 | 0 |
| 0.8895833333333334 | 0 |
| 0.8902777777777778 | 0 |
| 0.8909722222222222 | 0 |
| 0.8916666666666666 | 0 |
| 0.8923611111111112 | 0 |
| 0.8930555555555556 | 0 |
| 0.8937499999999999 | 0 |
| 0.8944444444444444 | 0 |
| 0.8951388888888889 | 0 |
| 0.8958333333333334 | 0 |
| 0.8965277777777777 | 0 |
| 0.8972222222222223 | 0 |
| 0.8979166666666667 | 0 |
| 0.8986111111111111 | 0 |
| 0.8993055555555555 | 0 |
| 0.9 | 0 |
| 0.9006944444444445 | 0 |
| 0.9013888888888889 | 0 |
| 0.9020833333333332 | 0 |
| 0.9027777777777778 | 0 |
| 0.9034722222222222 | 0 |
| 0.9041666666666667 | 0 |
| 0.904861111111111 | 0 |
| 0.9055555555555556 | 0 |
| 0.90625 | 0 |
| 0.9069444444444444 | 0 |
| 0.907638888888889 | 0 |
| 0.9083333333333333 | 0 |
| 0.9090277777777778 | 0 |
| 0.9097222222222222 | 0 |
| 0.9104166666666668 | 0 |
| 0.9111111111111111 | 0 |
| 0.9118055555555555 | 0 |
| 0.9125 | 0 |
| 0.9131944444444445 | 0 |
| 0.9138888888888889 | 0 |
| 0.9145833333333333 | 0 |
| 0.9152777777777777 | 0 |
| 0.9159722222222223 | 0 |
| 0.9166666666666666 | 0 |
| 0.9173611111111111 | 0 |
| 0.9180555555555556 | 0 |
| 0.9187500000000001 | 0 |
| 0.9194444444444444 | 0 |
| 0.9201388888888888 | 0 |
| 0.9208333333333334 | 0 |
| 0.9215277777777778 | 0 |
| 0.9222222222222222 | 0 |
| 0.9229166666666666 | 0 |
| 0.9236111111111112 | 0 |
| 0.9243055555555556 | 0 |
| 0.9249999999999999 | 0 |
| 0.9256944444444444 | 0 |
| 0.9263888888888889 | 0 |
| 0.9270833333333334 | 0 |
| 0.9277777777777777 | 0 |
| 0.9284722222222223 | 0 |
| 0.9291666666666667 | 0 |
| 0.9298611111111111 | 0 |
| 0.9305555555555555 | 0 |
| 0.93125 | 0 |
| 0.9319444444444445 | 0 |
| 0.9326388888888889 | 0 |
| 0.9333333333333332 | 0 |
| 0.9340277777777778 | 0 |
| 0.9347222222222222 | 0 |
| 0.9354166666666667 | 0 |
| 0.936111111111111 | 0 |
| 0.9368055555555556 | 0 |
| 0.9375 | 0 |
| 0.9381944444444444 | 0 |
| 0.938888888888889 | 0 |
| 0.9395833333333333 | 0 |
| 0.9402777777777778 | 0 |
| 0.9409722222222222 | 0 |
| 0.9416666666666668 | 0 |
| 0.9423611111111111 | 0 |
| 0.9430555555555555 | 0 |
| 0.94375 | 0 |
| 0.9444444444444445 | 0 |
| 0.9451388888888889 | 0 |
| 0.9458333333333333 | 0 |
| 0.9465277777777777 | 0 |
| 0.9472222222222223 | 0 |
| 0.9479166666666666 | 0 |
| 0.9486111111111111 | 0 |
| 0.9493055555555556 | 0 |
| 0.9500000000000001 | 0 |
| 0.9506944444444444 | 0 |
| 0.9513888888888888 | 0 |
| 0.9520833333333334 | 0 |
| 0.9527777777777778 | 0 |
| 0.9534722222222222 | 0 |
| 0.9541666666666666 | 0 |
| 0.9548611111111112 | 0 |
| 0.9555555555555556 | 0 |
| 0.9562499999999999 | 0 |
| 0.9569444444444444 | 0 |
| 0.9576388888888889 | 0 |
| 0.9583333333333334 | 0 |
| 0.9590277777777777 | 0 |
| 0.9597222222222223 | 0 |
| 0.9604166666666667 | 0 |
| 0.9611111111111111 | 0 |
| 0.9618055555555555 | 0 |
| 0.9625 | 0 |
| 0.9631944444444445 | 0 |
| 0.9638888888888889 | 0 |
| 0.9645833333333332 | 0 |
| 0.9652777777777778 | 0 |
| 0.9659722222222222 | 0 |
| 0.9666666666666667 | 0 |
| 0.967361111111111 | 0 |
| 0.9680555555555556 | 0 |
| 0.96875 | 0 |
| 0.9694444444444444 | 0 |
| 0.970138888888889 | 0 |
| 0.9708333333333333 | 0 |
| 0.9715277777777778 | 0 |
| 0.9722222222222222 | 0 |
| 0.9729166666666668 | 0 |
| 0.9736111111111111 | 0 |
| 0.9743055555555555 | 0 |
| 0.975 | 0 |
| 0.9756944444444445 | 0 |
| 0.9763888888888889 | 0 |
| 0.9770833333333333 | 0 |
| 0.9777777777777777 | 0 |
| 0.9784722222222223 | 0 |
| 0.9791666666666666 | 0 |
| 0.9798611111111111 | 0 |
| 0.9805555555555556 | 0 |
| 0.9812500000000001 | 0 |
| 0.9819444444444444 | 0 |
| 0.9826388888888888 | 0 |
| 0.9833333333333334 | 0 |
| 0.9840277777777778 | 0 |
| 0.9847222222222222 | 0 |
| 0.9854166666666666 | 0 |
| 0.9861111111111112 | 0 |
| 0.9868055555555556 | 0 |
| 0.9874999999999999 | 0 |
| 0.9881944444444444 | 0 |
| 0.9888888888888889 | 0 |
| 0.9895833333333334 | 0 |
| 0.9902777777777777 | 0 |
| 0.9909722222222223 | 0 |
| 0.9916666666666667 | 0 |
| 0.9923611111111111 | 0 |
| 0.9930555555555555 | 0 |
| 0.99375 | 0 |
| 0.9944444444444445 | 0 |
| 0.9951388888888889 | 0 |
| 0.9958333333333332 | 0 |
| 0.9965277777777778 | 0 |
| 0.9972222222222222 | 0 |
| 0.9979166666666667 | 0 |
| 0.998611111111111 | 0 |
| 0.9993055555555556 | 0 |